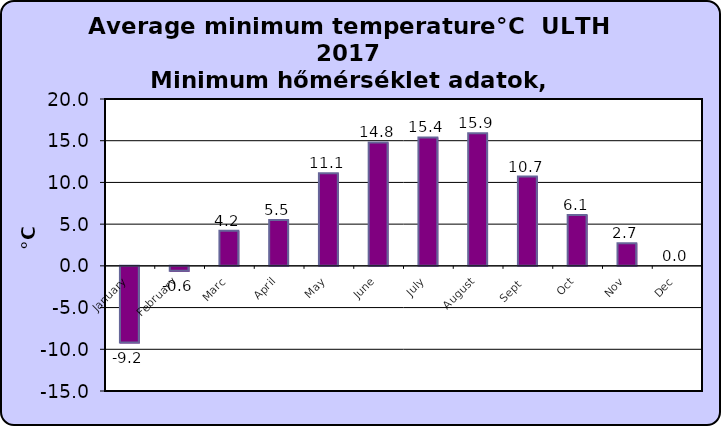
| Category | Series 0 |
|---|---|
| January | -9.2 |
| February | -0.6 |
| Marc | 4.2 |
| April | 5.5 |
| May | 11.1 |
| June | 14.8 |
| July | 15.4 |
| August | 15.9 |
| Sept  | 10.7 |
| Oct | 6.1 |
| Nov | 2.7 |
| Dec | 0 |